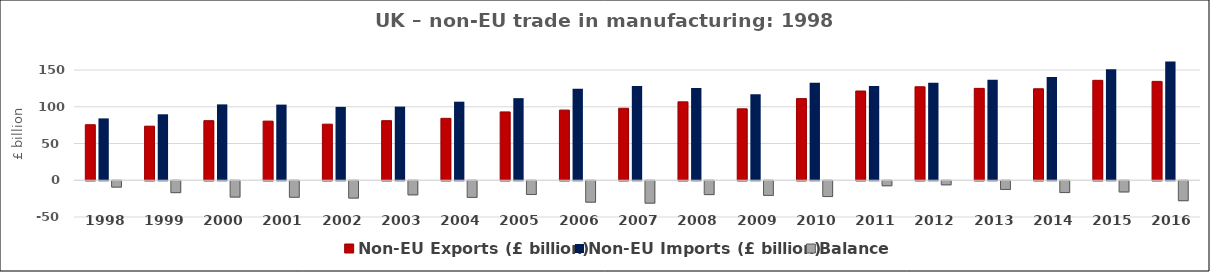
| Category | Non-EU Exports (£ billion) | Non-EU Imports (£ billion) | Balance |
|---|---|---|---|
| 1998 | 75.581 | 84.192 | -8.611 |
| 1999 | 73.629 | 89.792 | -16.162 |
| 2000 | 81.087 | 103.269 | -22.182 |
| 2001 | 80.502 | 102.966 | -22.464 |
| 2002 | 76.329 | 99.89 | -23.561 |
| 2003 | 81.077 | 100.233 | -19.156 |
| 2004 | 84.271 | 106.932 | -22.661 |
| 2005 | 93.002 | 111.733 | -18.731 |
| 2006 | 95.511 | 124.632 | -29.121 |
| 2007 | 97.984 | 128.423 | -30.439 |
| 2008 | 106.753 | 125.56 | -18.807 |
| 2009 | 97.23 | 117.125 | -19.894 |
| 2010 | 111.138 | 132.62 | -21.482 |
| 2011 | 121.452 | 128.258 | -6.806 |
| 2012 | 127.235 | 132.767 | -5.533 |
| 2013 | 125.054 | 136.875 | -11.821 |
| 2014 | 124.511 | 140.561 | -16.051 |
| 2015 | 136.018 | 151.216 | -15.198 |
| 2016 | 134.563 | 161.701 | -27.138 |